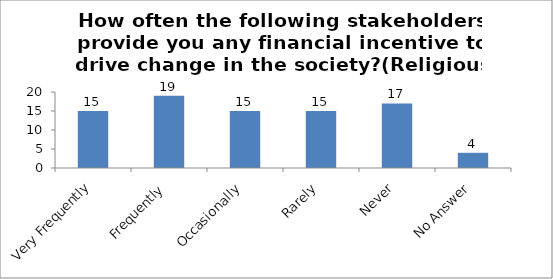
| Category | How often the following stakeholders provide you any financial incentive to drive change in the society?(Religious Leaders) |
|---|---|
| Very Frequently | 15 |
| Frequently | 19 |
| Occasionally | 15 |
| Rarely | 15 |
| Never | 17 |
| No Answer | 4 |